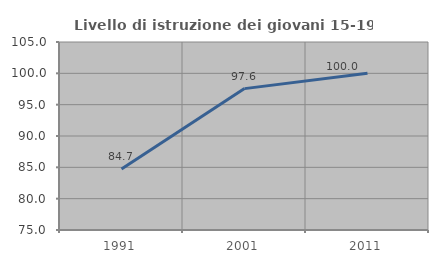
| Category | Livello di istruzione dei giovani 15-19 anni |
|---|---|
| 1991.0 | 84.722 |
| 2001.0 | 97.561 |
| 2011.0 | 100 |